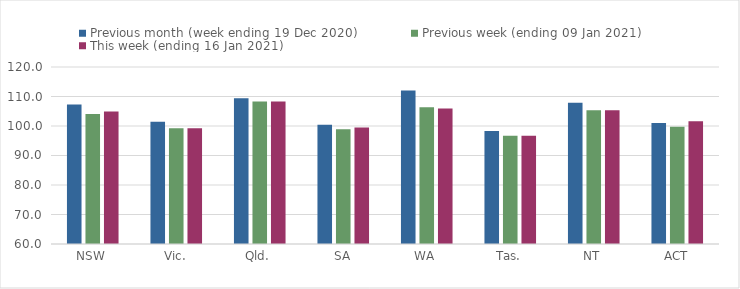
| Category | Previous month (week ending 19 Dec 2020) | Previous week (ending 09 Jan 2021) | This week (ending 16 Jan 2021) |
|---|---|---|---|
| NSW | 107.32 | 104.09 | 104.89 |
| Vic. | 101.45 | 99.24 | 99.24 |
| Qld. | 109.4 | 108.27 | 108.27 |
| SA | 100.4 | 98.91 | 99.49 |
| WA | 112.07 | 106.38 | 105.97 |
| Tas. | 98.31 | 96.72 | 96.72 |
| NT | 107.87 | 105.35 | 105.31 |
| ACT | 101.02 | 99.73 | 101.64 |